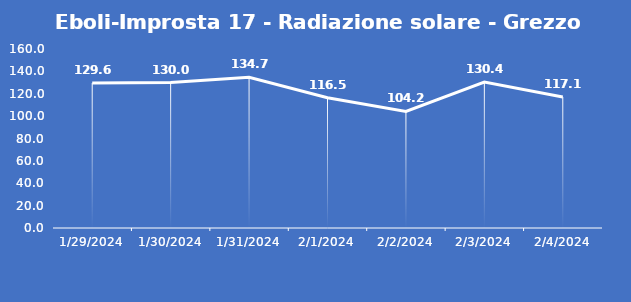
| Category | Eboli-Improsta 17 - Radiazione solare - Grezzo (W/m2) |
|---|---|
| 1/29/24 | 129.6 |
| 1/30/24 | 130 |
| 1/31/24 | 134.7 |
| 2/1/24 | 116.5 |
| 2/2/24 | 104.2 |
| 2/3/24 | 130.4 |
| 2/4/24 | 117.1 |